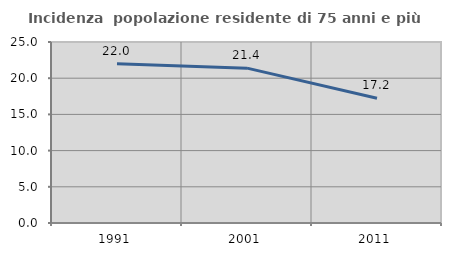
| Category | Incidenza  popolazione residente di 75 anni e più |
|---|---|
| 1991.0 | 21.99 |
| 2001.0 | 21.39 |
| 2011.0 | 17.241 |